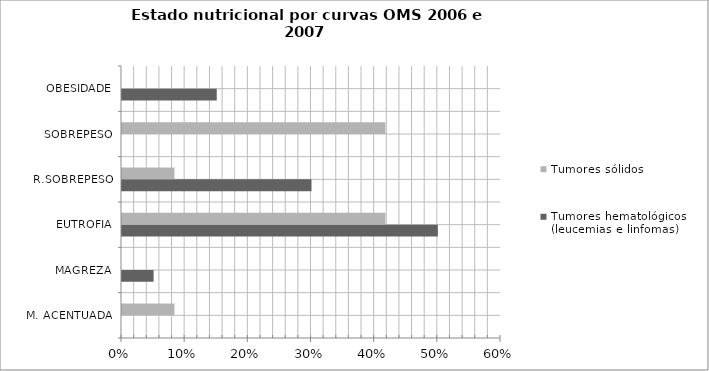
| Category | Tumores hematológicos (leucemias e linfomas) | Tumores sólidos |
|---|---|---|
| M. ACENTUADA | 0 | 8.3 |
| MAGREZA | 5 | 0 |
| EUTROFIA | 50 | 41.7 |
| R.SOBREPESO | 30 | 8.3 |
| SOBREPESO | 0 | 41.7 |
| OBESIDADE | 15 | 0 |